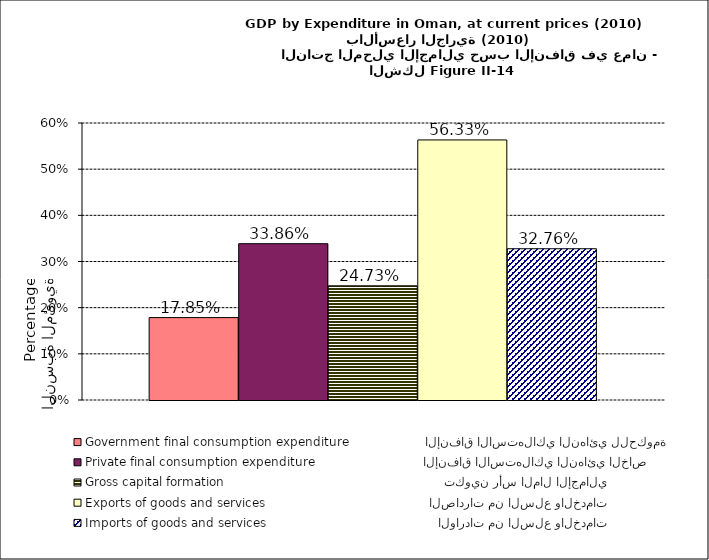
| Category | Government final consumption expenditure                   الإنفاق الاستهلاكي النهائي للحكومة | Private final consumption expenditure                           الإنفاق الاستهلاكي النهائي الخاص | Gross capital formation                                                       تكوين رأس المال الإجمالي | Exports of goods and services                                         الصادرات من السلع والخدمات | Imports of goods and services                                           الواردات من السلع والخدمات |
|---|---|---|---|---|---|
| 0 | 0.179 | 0.339 | 0.247 | 0.563 | 0.328 |